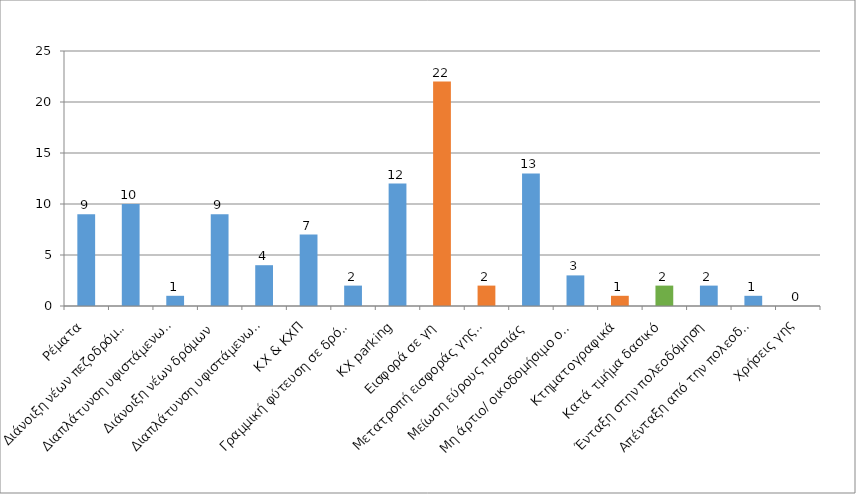
| Category | Series 0 |
|---|---|
| Ρέματα | 9 |
| Διάνοιξη νέων πεζοδρόμων | 10 |
| Διαπλάτυνση υφιστάμενων πεζοδρόμων | 1 |
| Διάνοιξη νέων δρόμων | 9 |
| Διαπλάτυνση υφιστάμενων δρόμων | 4 |
| ΚΧ & ΚΧΠ | 7 |
| Γραμμική φύτευση σε δρόμους | 2 |
| ΚΧ parking | 12 |
| Εισφορά σε γη | 22 |
| Μετατροπή εισφοράς γης σε χρήμα | 2 |
| Μείωση εύρους πρασιάς | 13 |
| Μη άρτιο/ οικοδομήσιμο οικόπεδο | 3 |
| Κτηματογραφικά | 1 |
| Κατά τμήμα δασικό | 2 |
| Ένταξη στην πολεοδόμηση | 2 |
| Απένταξη από την πολεοδόμηση | 1 |
| Χρήσεις γης | 0 |